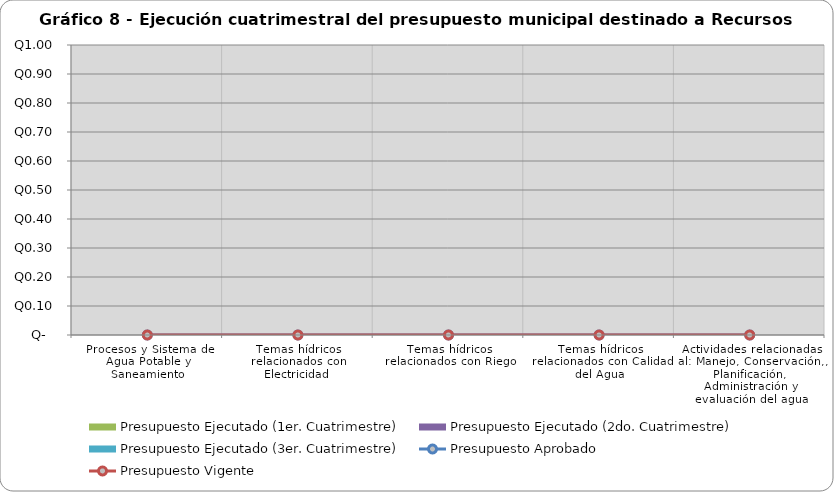
| Category | Presupuesto Ejecutado (1er. Cuatrimestre) | Presupuesto Ejecutado (2do. Cuatrimestre) | Presupuesto Ejecutado (3er. Cuatrimestre) |
|---|---|---|---|
| Procesos y Sistema de Agua Potable y Saneamiento | 0 | 0 | 0 |
| Temas hídricos relacionados con Electricidad  | 0 | 0 | 0 |
| Temas hídricos relacionados con Riego | 0 | 0 | 0 |
| Temas hídricos relacionados con Calidad del Agua | 0 | 0 | 0 |
| Actividades relacionadas al: Manejo, Conservación,, Planificación, Administración y evaluación del agua | 0 | 0 | 0 |